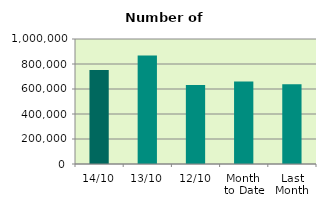
| Category | Series 0 |
|---|---|
| 14/10 | 752146 |
| 13/10 | 867638 |
| 12/10 | 631928 |
| Month 
to Date | 660174.2 |
| Last
Month | 637968.273 |